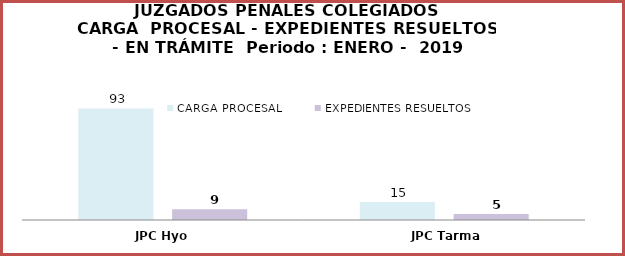
| Category | CARGA PROCESAL | EXPEDIENTES RESUELTOS |
|---|---|---|
| JPC Hyo | 93 | 9 |
| JPC Tarma | 15 | 5 |